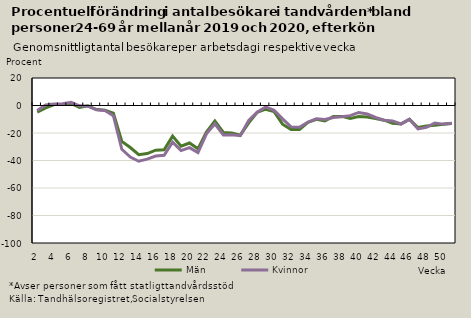
| Category | Män | Kvinnor |
|---|---|---|
| 2.0 | -4.829 | -3.624 |
| 3.0 | -1.776 | 0.396 |
| 4.0 | 0.714 | 1.076 |
| 5.0 | 0.922 | 1.335 |
| 6.0 | 1.532 | 2.259 |
| 7.0 | -1.492 | -0.214 |
| 8.0 | -0.213 | -0.467 |
| 9.0 | -2.94 | -3.138 |
| 10.0 | -3.447 | -3.644 |
| 11.0 | -5.625 | -7.368 |
| 12.0 | -26.099 | -31.844 |
| 13.0 | -30.546 | -37.534 |
| 14.0 | -35.786 | -40.533 |
| 15.0 | -34.952 | -38.987 |
| 16.0 | -32.517 | -36.705 |
| 17.0 | -32.225 | -36.252 |
| 18.0 | -22.261 | -26.655 |
| 19.0 | -29.643 | -32.805 |
| 20.0 | -27.283 | -30.64 |
| 21.0 | -31.493 | -34.271 |
| 22.0 | -19.265 | -20.591 |
| 23.0 | -11.274 | -13.288 |
| 24.0 | -19.549 | -21.421 |
| 25.0 | -19.917 | -21.294 |
| 26.0 | -21.566 | -22.006 |
| 27.0 | -12.663 | -10.881 |
| 28.0 | -4.906 | -4.839 |
| 29.0 | -2.689 | -0.956 |
| 30.0 | -4.467 | -3.492 |
| 31.0 | -13.58 | -9.679 |
| 32.0 | -17.412 | -15.545 |
| 33.0 | -17.486 | -15.782 |
| 34.0 | -12.329 | -12.011 |
| 35.0 | -10.07 | -9.602 |
| 36.0 | -11.253 | -10.199 |
| 37.0 | -8.027 | -8.754 |
| 38.0 | -7.93 | -8.153 |
| 39.0 | -9.388 | -7.386 |
| 40.0 | -8.018 | -5.045 |
| 41.0 | -8.329 | -6.191 |
| 42.0 | -9.431 | -8.726 |
| 43.0 | -10.7 | -10.717 |
| 44.0 | -12.945 | -11.21 |
| 45.0 | -13.376 | -13.473 |
| 46.0 | -10.083 | -9.972 |
| 47.0 | -15.97 | -17.042 |
| 48.0 | -14.838 | -15.876 |
| 49.0 | -14.451 | -12.755 |
| 50.0 | -13.691 | -13.537 |
| 51.0 | -13.029 | -12.937 |